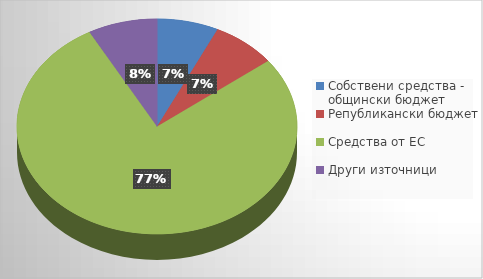
| Category | Series 0 |
|---|---|
| Собствени средства - общински бюджет  | 92372.55 |
| Републикански бюджет | 97038.7 |
| Средства от ЕС  | 1007287.95 |
| Други източници | 104060.8 |